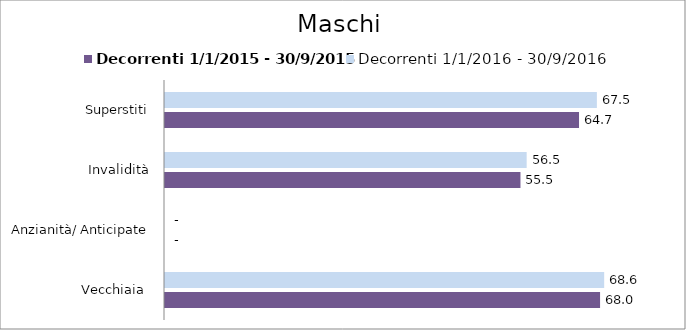
| Category | Decorrenti 1/1/2015 - 30/9/2015 | Decorrenti 1/1/2016 - 30/9/2016 |
|---|---|---|
| Vecchiaia  | 67.98 | 68.62 |
| Anzianità/ Anticipate | 0 | 0 |
| Invalidità | 55.54 | 56.51 |
| Superstiti | 64.69 | 67.48 |